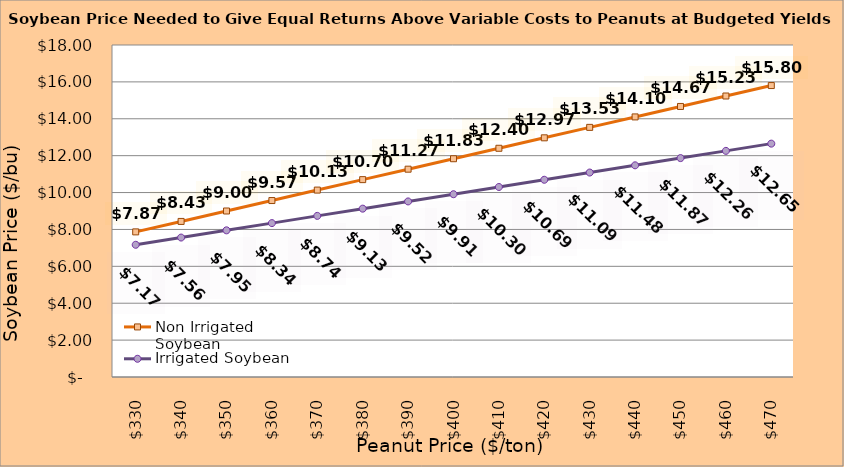
| Category | Non Irrigated Soybean | Irrigated Soybean |
|---|---|---|
| 330.0 | 7.867 | 7.169 |
| 340.0 | 8.434 | 7.56 |
| 350.0 | 9.001 | 7.952 |
| 360.0 | 9.567 | 8.344 |
| 370.0 | 10.134 | 8.735 |
| 380.0 | 10.701 | 9.127 |
| 390.0 | 11.267 | 9.519 |
| 400.0 | 11.834 | 9.91 |
| 410.0 | 12.401 | 10.302 |
| 420.0 | 12.967 | 10.694 |
| 430.0 | 13.534 | 11.085 |
| 440.0 | 14.101 | 11.477 |
| 450.0 | 14.667 | 11.869 |
| 460.0 | 15.234 | 12.26 |
| 470.0 | 15.801 | 12.652 |